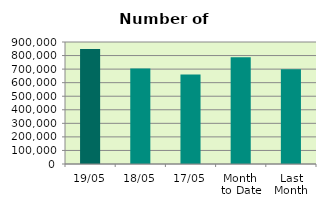
| Category | Series 0 |
|---|---|
| 19/05 | 848464 |
| 18/05 | 705288 |
| 17/05 | 660252 |
| Month 
to Date | 786588.615 |
| Last
Month | 699227 |